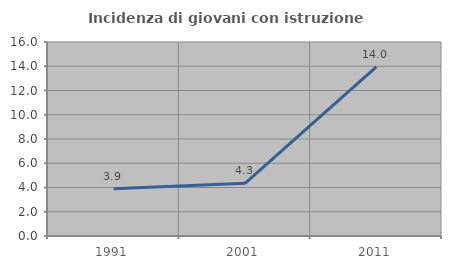
| Category | Incidenza di giovani con istruzione universitaria |
|---|---|
| 1991.0 | 3.889 |
| 2001.0 | 4.348 |
| 2011.0 | 13.953 |